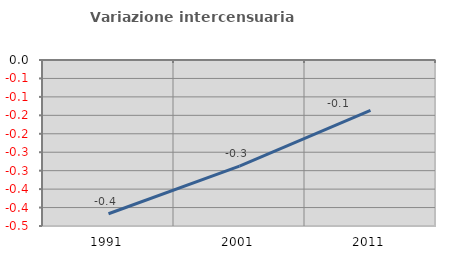
| Category | Variazione intercensuaria annua |
|---|---|
| 1991.0 | -0.417 |
| 2001.0 | -0.288 |
| 2011.0 | -0.136 |